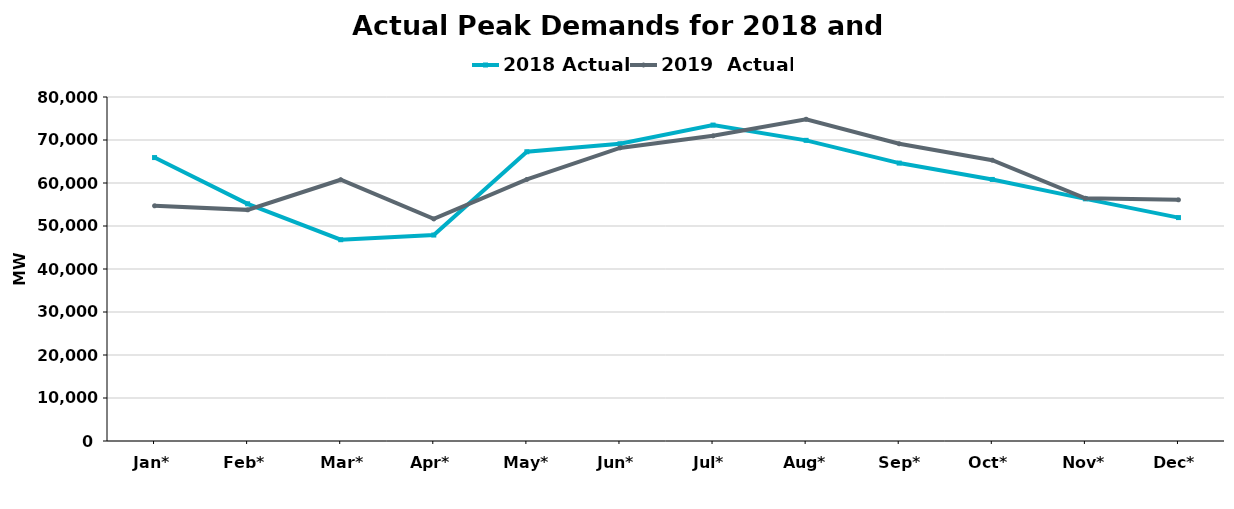
| Category | 2018 Actual | 2019  Actual |
|---|---|---|
| Jan* | 65915 | 54693 |
| Feb* | 55163 | 53752 |
| Mar* | 46812 | 60756 |
| Apr* | 47899 | 51640 |
| May* | 67265 | 60832 |
| Jun* | 69123 | 68159 |
| Jul* | 73473 | 70970 |
| Aug* | 69919 | 74820 |
| Sep* | 64630 | 69122 |
| Oct* | 60827 | 65304 |
| Nov* | 56317 | 56446 |
| Dec* | 51956 | 56080 |